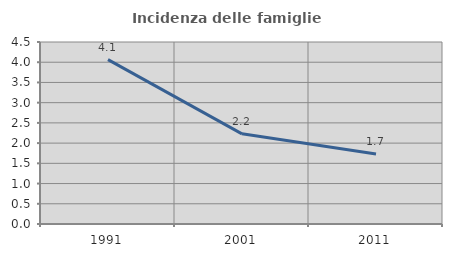
| Category | Incidenza delle famiglie numerose |
|---|---|
| 1991.0 | 4.064 |
| 2001.0 | 2.23 |
| 2011.0 | 1.73 |